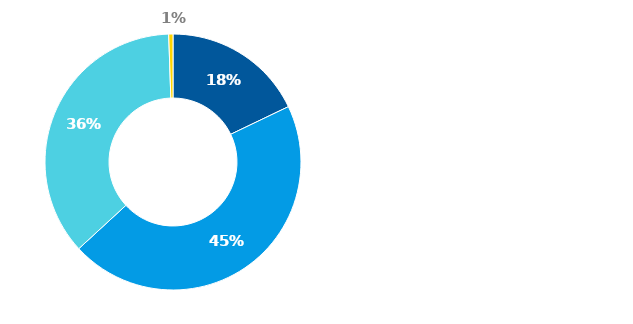
| Category | Series 0 |
|---|---|
| Hotovost | 0.179 |
| Půjčky poskytnuté nemovitostní společnosti | 0.453 |
| Majetkové účasti v nemovitostní společnosti | 0.363 |
| Ostatní finanční aktiva | 0.005 |